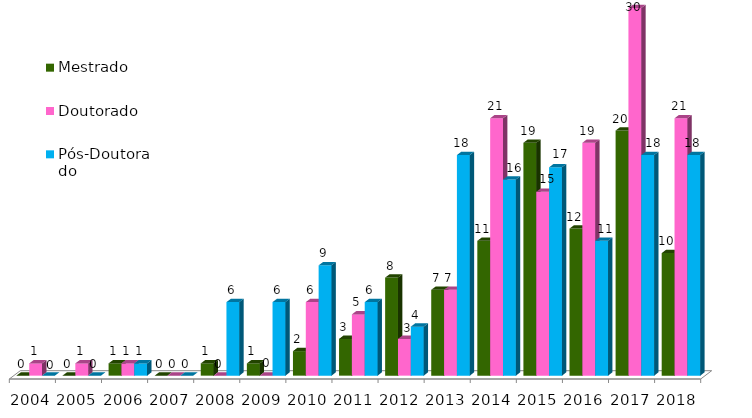
| Category | Mestrado | Doutorado  | Pós-Doutorado  |
|---|---|---|---|
| 2004.0 | 0 | 1 | 0 |
| 2005.0 | 0 | 1 | 0 |
| 2006.0 | 1 | 1 | 1 |
| 2007.0 | 0 | 0 | 0 |
| 2008.0 | 1 | 0 | 6 |
| 2009.0 | 1 | 0 | 6 |
| 2010.0 | 2 | 6 | 9 |
| 2011.0 | 3 | 5 | 6 |
| 2012.0 | 8 | 3 | 4 |
| 2013.0 | 7 | 7 | 18 |
| 2014.0 | 11 | 21 | 16 |
| 2015.0 | 19 | 15 | 17 |
| 2016.0 | 12 | 19 | 11 |
| 2017.0 | 20 | 30 | 18 |
| 2018.0 | 10 | 21 | 18 |